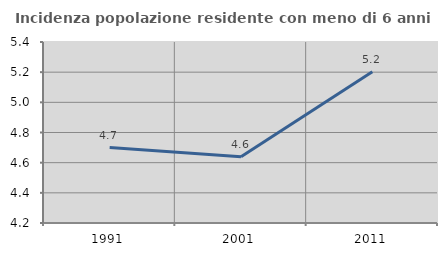
| Category | Incidenza popolazione residente con meno di 6 anni |
|---|---|
| 1991.0 | 4.7 |
| 2001.0 | 4.639 |
| 2011.0 | 5.202 |